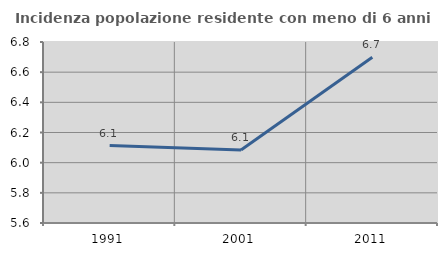
| Category | Incidenza popolazione residente con meno di 6 anni |
|---|---|
| 1991.0 | 6.113 |
| 2001.0 | 6.083 |
| 2011.0 | 6.699 |